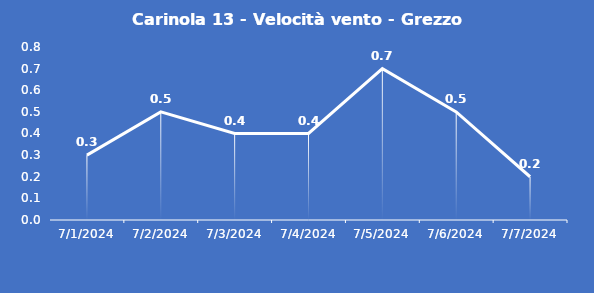
| Category | Carinola 13 - Velocità vento - Grezzo (m/s) |
|---|---|
| 7/1/24 | 0.3 |
| 7/2/24 | 0.5 |
| 7/3/24 | 0.4 |
| 7/4/24 | 0.4 |
| 7/5/24 | 0.7 |
| 7/6/24 | 0.5 |
| 7/7/24 | 0.2 |